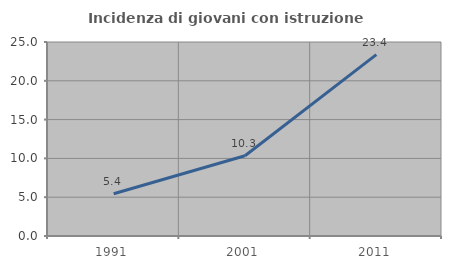
| Category | Incidenza di giovani con istruzione universitaria |
|---|---|
| 1991.0 | 5.446 |
| 2001.0 | 10.336 |
| 2011.0 | 23.371 |